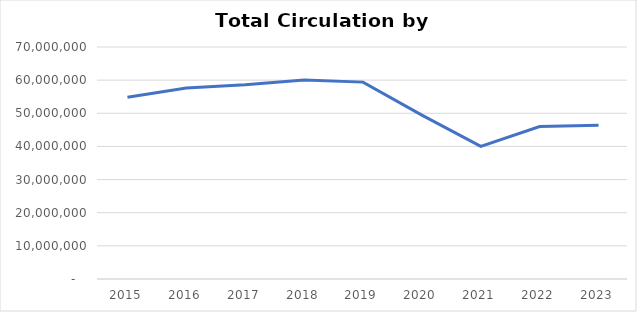
| Category | Total
Circulation |
|---|---|
| 2015.0 | 54825928 |
| 2016.0 | 57649456 |
| 2017.0 | 58600906 |
| 2018.0 | 60048675 |
| 2019.0 | 59404667 |
| 2020.0 | 49445167 |
| 2021.0 | 39998967 |
| 2022.0 | 45993831 |
| 2023.0 | 46380880 |